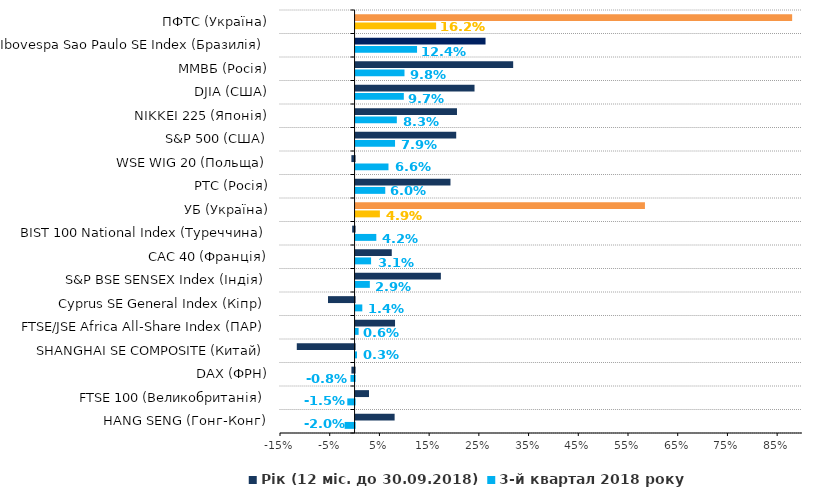
| Category | 3-й квартал 2018 року | Рік (12 міс. до 30.09.2018) |
|---|---|---|
| HANG SENG (Гонг-Конг) | -0.02 | 0.079 |
| FTSE 100 (Великобританія) | -0.015 | 0.027 |
| DAX (ФРН) | -0.008 | -0.006 |
| SHANGHAI SE COMPOSITE (Китай) | 0.003 | -0.116 |
| FTSE/JSE Africa All-Share Index (ПАР) | 0.006 | 0.079 |
| Cyprus SE General Index (Кіпр) | 0.014 | -0.053 |
| S&P BSE SENSEX Index (Індія) | 0.029 | 0.172 |
| CAC 40 (Франція) | 0.031 | 0.073 |
| BIST 100 National Index (Туреччина) | 0.042 | -0.005 |
| УБ (Україна) | 0.049 | 0.582 |
| РТС (Росія) | 0.06 | 0.191 |
| WSE WIG 20 (Польща) | 0.066 | -0.006 |
| S&P 500 (США) | 0.079 | 0.202 |
| NIKKEI 225 (Японія) | 0.083 | 0.204 |
| DJIA (США) | 0.097 | 0.239 |
| ММВБ (Росія) | 0.098 | 0.317 |
| Ibovespa Sao Paulo SE Index (Бразилія) | 0.124 | 0.261 |
| ПФТС (Україна) | 0.162 | 0.878 |